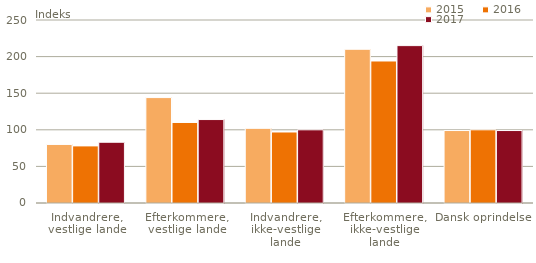
| Category | 2015 | 2016 | 2017 |
|---|---|---|---|
| Indvandrere,
vestlige lande | 80 | 78 | 83 |
| Efterkommere,
vestlige lande | 144 | 110 | 114 |
| Indvandrere,
ikke-vestlige lande | 102 | 97 | 100 |
| Efterkommere,
ikke-vestlige lande | 210 | 194 | 215 |
| Dansk oprindelse | 99 | 100 | 99 |